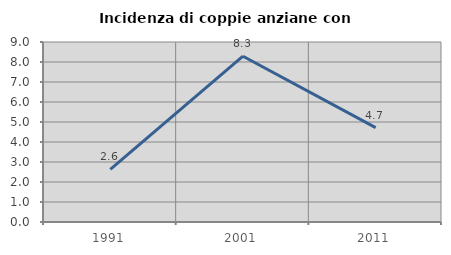
| Category | Incidenza di coppie anziane con figli |
|---|---|
| 1991.0 | 2.632 |
| 2001.0 | 8.29 |
| 2011.0 | 4.722 |